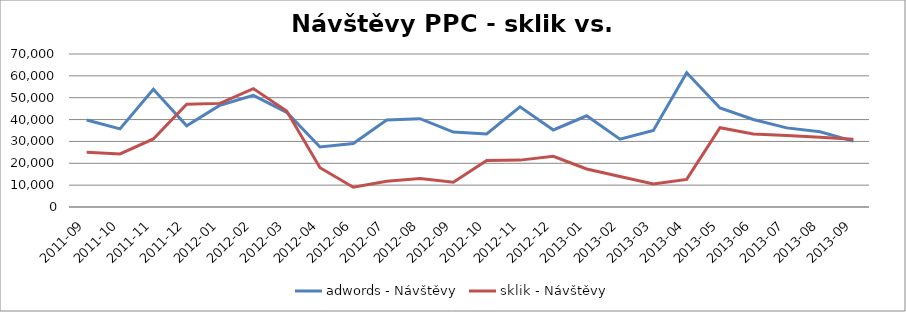
| Category | adwords - Návštěvy | sklik - Návštěvy |
|---|---|---|
| 2011-09 | 39791.177 | 25027.731 |
| 2011-10 | 35719.928 | 24272.919 |
| 2011-11 | 53827.791 | 31143.424 |
| 2011-12 | 37168.641 | 46992.628 |
| 2012-01 | 46550.478 | 47408.578 |
| 2012-02 | 51069.818 | 54171.657 |
| 2012-03 | 43329.706 | 43911.974 |
| 2012-04 | 27476.596 | 17952.993 |
| 2012-06 | 29038.927 | 9067.913 |
| 2012-07 | 39768.474 | 11786.325 |
| 2012-08 | 40411.483 | 12993.67 |
| 2012-09 | 34296.401 | 11334.602 |
| 2012-10 | 33433.076 | 21246.438 |
| 2012-11 | 45838.831 | 21446.898 |
| 2012-12 | 35250.521 | 23202.149 |
| 2013-01 | 41747.4 | 17378.747 |
| 2013-02 | 31062.41 | 13931.479 |
| 2013-03 | 35007.459 | 10575.008 |
| 2013-04 | 61430.545 | 12637.444 |
| 2013-05 | 45281.613 | 36279.505 |
| 2013-06 | 40022.709 | 33369.741 |
| 2013-07 | 36204.543 | 32717.301 |
| 2013-08 | 34452.286 | 31923.053 |
| 2013-09 | 30125.753 | 31036.258 |